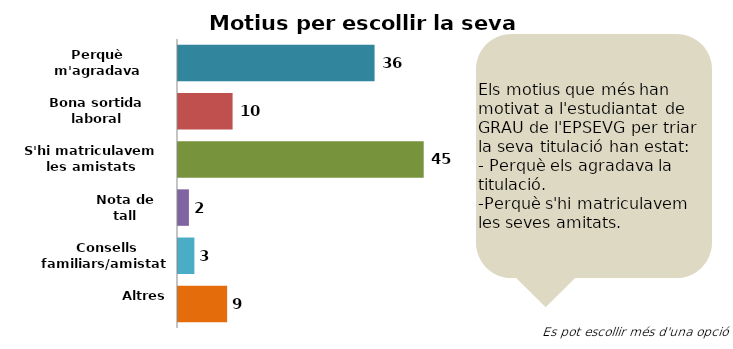
| Category | EPSEVG |
|---|---|
| Perquè m'agradava | 36 |
| Bona sortida laboral | 10 |
| S'hi matriculavem les amistats | 45 |
| Nota de tall | 2 |
|  Consells familiars/amistats | 3 |
| Altres | 9 |